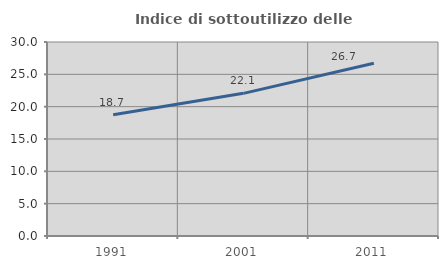
| Category | Indice di sottoutilizzo delle abitazioni  |
|---|---|
| 1991.0 | 18.734 |
| 2001.0 | 22.06 |
| 2011.0 | 26.712 |